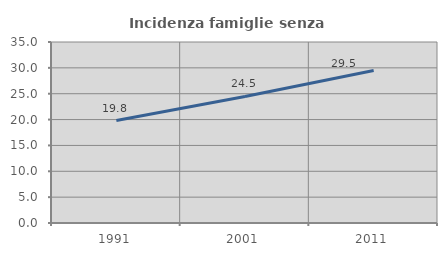
| Category | Incidenza famiglie senza nuclei |
|---|---|
| 1991.0 | 19.816 |
| 2001.0 | 24.469 |
| 2011.0 | 29.477 |